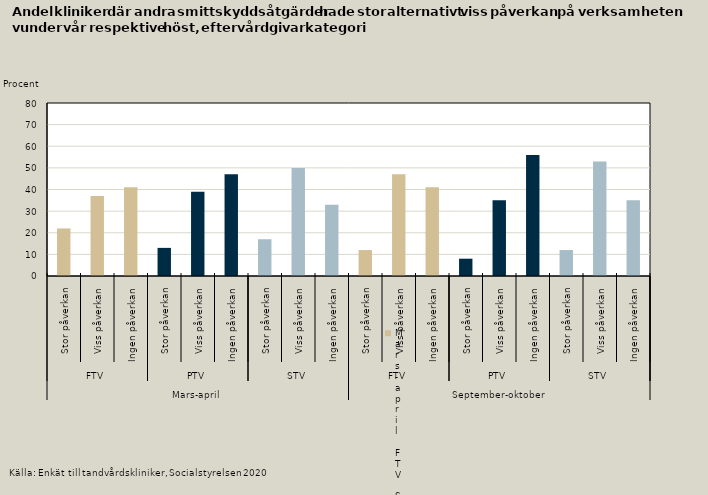
| Category | Andra smittskyddsåtgärder |
|---|---|
| 0 | 22 |
| 1 | 37 |
| 2 | 41 |
| 3 | 13 |
| 4 | 39 |
| 5 | 47 |
| 6 | 17 |
| 7 | 50 |
| 8 | 33 |
| 9 | 12 |
| 10 | 47 |
| 11 | 41 |
| 12 | 8 |
| 13 | 35 |
| 14 | 56 |
| 15 | 12 |
| 16 | 53 |
| 17 | 35 |